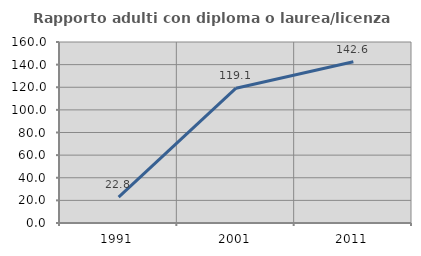
| Category | Rapporto adulti con diploma o laurea/licenza media  |
|---|---|
| 1991.0 | 22.807 |
| 2001.0 | 119.149 |
| 2011.0 | 142.593 |